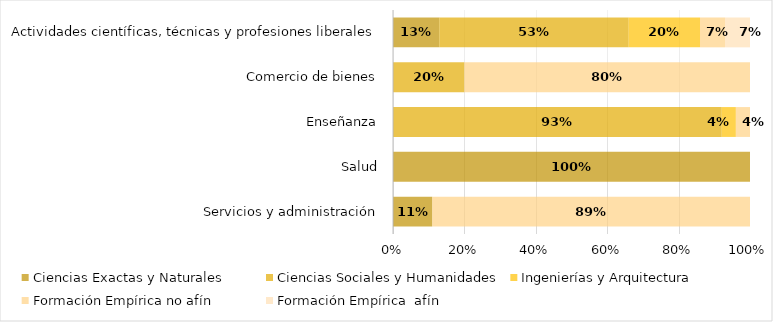
| Category | Ciencias Exactas y Naturales | Ciencias Sociales y Humanidades | Ingenierías y Arquitectura | Formación Empírica no afín | Formación Empírica  afín |
|---|---|---|---|---|---|
| Servicios y administración | 0.11 | 0 | 0 | 0.89 | 0 |
| Salud | 1 | 0 | 0 | 0 | 0 |
| Enseñanza | 0 | 0.93 | 0.04 | 0.04 | 0 |
| Comercio de bienes | 0 | 0.2 | 0 | 0.8 | 0 |
| Actividades científicas, técnicas y profesiones liberales | 0.13 | 0.53 | 0.2 | 0.07 | 0.07 |